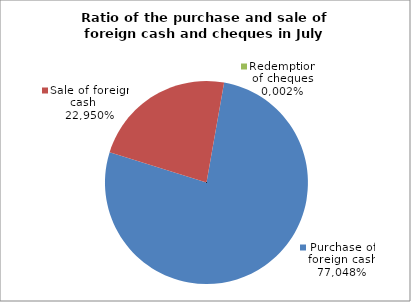
| Category | Purchase of foreign cash |
|---|---|
| 0 | 0.77 |
| 1 | 0.23 |
| 2 | 0 |